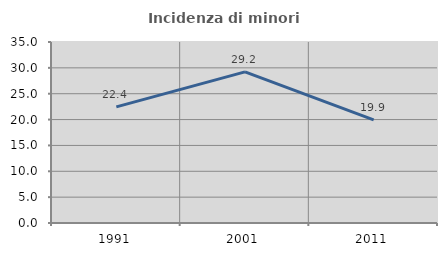
| Category | Incidenza di minori stranieri |
|---|---|
| 1991.0 | 22.449 |
| 2001.0 | 29.231 |
| 2011.0 | 19.923 |